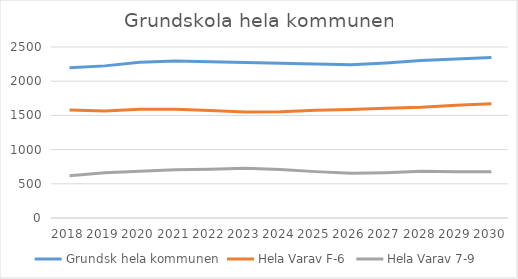
| Category | Grundsk hela kommunen | Hela Varav F-6 | Hela Varav 7-9 |
|---|---|---|---|
| 2018.0 | 2197 | 1579 | 618 |
| 2019.0 | 2224 | 1563 | 661 |
| 2020.0 | 2276 | 1591 | 685 |
| 2021.0 | 2295 | 1590 | 705 |
| 2022.0 | 2283 | 1571 | 712 |
| 2023.0 | 2274 | 1548 | 726 |
| 2024.0 | 2264 | 1555 | 709 |
| 2025.0 | 2252 | 1574 | 678 |
| 2026.0 | 2239 | 1586 | 653 |
| 2027.0 | 2265 | 1603 | 662 |
| 2028.0 | 2301 | 1619 | 682 |
| 2029.0 | 2325 | 1650 | 675 |
| 2030.0 | 2345 | 1669 | 676 |